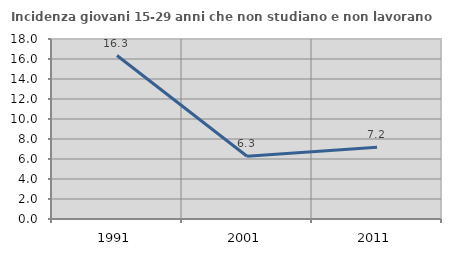
| Category | Incidenza giovani 15-29 anni che non studiano e non lavorano  |
|---|---|
| 1991.0 | 16.346 |
| 2001.0 | 6.275 |
| 2011.0 | 7.183 |